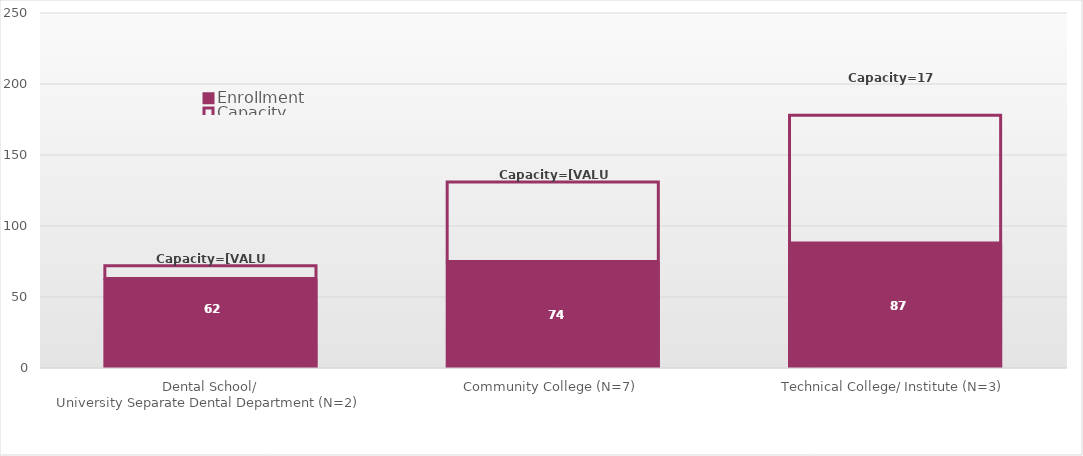
| Category | Enrollment | Capacity  | CapacitySum |
|---|---|---|---|
| Dental School/
University Separate Dental Department (N=2) | 62 | 10 | 72 |
| Community College (N=7) | 74 | 57 | 131 |
| Technical College/ Institute (N=3) | 87 | 91 | 178 |